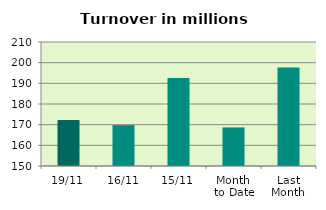
| Category | Series 0 |
|---|---|
| 19/11 | 172.235 |
| 16/11 | 169.771 |
| 15/11 | 192.622 |
| Month 
to Date | 168.67 |
| Last
Month | 197.652 |